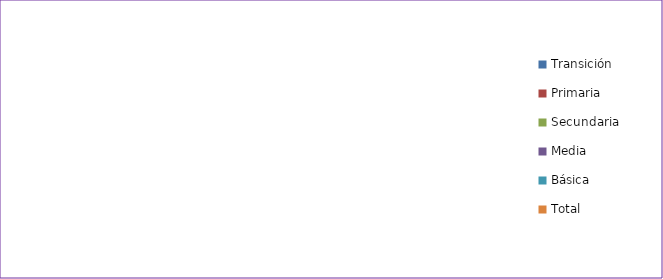
| Category | Tasa Aprobación |
|---|---|
| Transición | 0 |
| Primaria | 0 |
| Secundaria | 0 |
| Media | 0 |
| Básica | 0 |
| Total | 0 |